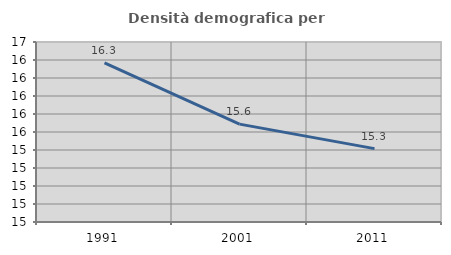
| Category | Densità demografica |
|---|---|
| 1991.0 | 16.269 |
| 2001.0 | 15.588 |
| 2011.0 | 15.315 |